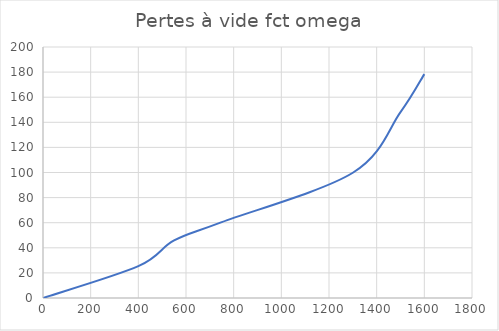
| Category | pertes vide  |
|---|---|
| 0.0 | 0 |
| 400.0 | 25.355 |
| 550.0 | 45.825 |
| 750.0 | 60.427 |
| 1300.0 | 99.793 |
| 1500.0 | 148.108 |
| 1600.0 | 178.404 |